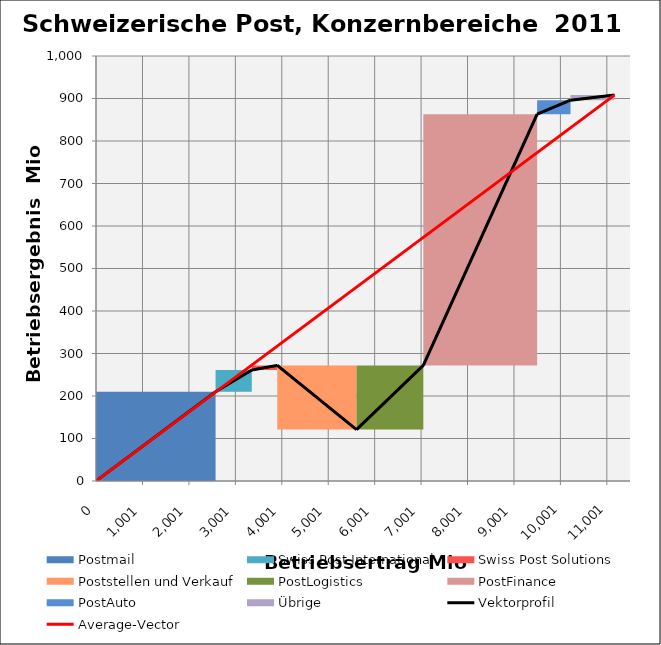
| Category | transparent | Postmail | Swiss Post International | Swiss Post Solutions | Poststellen und Verkauf | PostLogistics | PostFinance | PostAuto | Übrige | Border right & top |
|---|---|---|---|---|---|---|---|---|---|---|
| 0.0 | 0 | 210 | 0 | 0 | 0 | 0 | 0 | 0 | 0 | 0 |
| 2575.0 | 0 | 210 | 0 | 0 | 0 | 0 | 0 | 0 | 0 | 0 |
| 2575.0 | 210 | 0 | 51 | 0 | 0 | 0 | 0 | 0 | 0 | 0 |
| 3355.0 | 210 | 0 | 51 | 0 | 0 | 0 | 0 | 0 | 0 | 0 |
| 3355.0 | 261 | 0 | 0 | 11 | 0 | 0 | 0 | 0 | 0 | 0 |
| 3904.0 | 261 | 0 | 0 | 11 | 0 | 0 | 0 | 0 | 0 | 0 |
| 3904.0 | 272 | 0 | 0 | 0 | -151 | 0 | 0 | 0 | 0 | 0 |
| 5610.0 | 272 | 0 | 0 | 0 | -151 | 0 | 0 | 0 | 0 | 0 |
| 5610.0 | 121 | 0 | 0 | 0 | 0 | 151 | 0 | 0 | 0 | 0 |
| 7049.0 | 121 | 0 | 0 | 0 | 0 | 151 | 0 | 0 | 0 | 0 |
| 7049.0 | 272 | 0 | 0 | 0 | 0 | 0 | 591 | 0 | 0 | 0 |
| 9500.0 | 272 | 0 | 0 | 0 | 0 | 0 | 591 | 0 | 0 | 0 |
| 9500.0 | 863 | 0 | 0 | 0 | 0 | 0 | 0 | 33 | 0 | 0 |
| 10219.0 | 863 | 0 | 0 | 0 | 0 | 0 | 0 | 33 | 0 | 0 |
| 10219.0 | 896 | 0 | 0 | 0 | 0 | 0 | 0 | 0 | 12 | 0 |
| 11164.0 | 896 | 0 | 0 | 0 | 0 | 0 | 0 | 0 | 12 | 0 |
| 11164.0 | 908 | 0 | 0 | 0 | 0 | 0 | 0 | 0 | 0 | 0 |
| 11164.0 | 908 | 0 | 0 | 0 | 0 | 0 | 0 | 0 | 0 | 0 |
| 11164.0 | 908 | 0 | 0 | 0 | 0 | 0 | 0 | 0 | 0 | 0 |
| 11164.0 | 908 | 0 | 0 | 0 | 0 | 0 | 0 | 0 | 0 | 0 |
| 11164.0 | 908 | 0 | 0 | 0 | 0 | 0 | 0 | 0 | 0 | 0 |
| 11500.0 | 908 | 0 | 0 | 0 | 0 | 0 | 0 | 0 | 0 | 0 |
| 11500.0 | 908 | 0 | 0 | 0 | 0 | 0 | 0 | 0 | 0 | 0 |